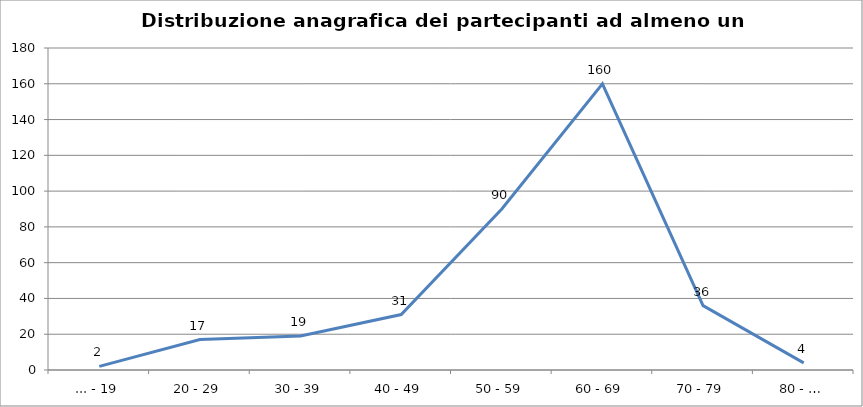
| Category | Nr. Tesserati |
|---|---|
| ... - 19 | 2 |
| 20 - 29 | 17 |
| 30 - 39 | 19 |
| 40 - 49 | 31 |
| 50 - 59 | 90 |
| 60 - 69 | 160 |
| 70 - 79 | 36 |
| 80 - … | 4 |